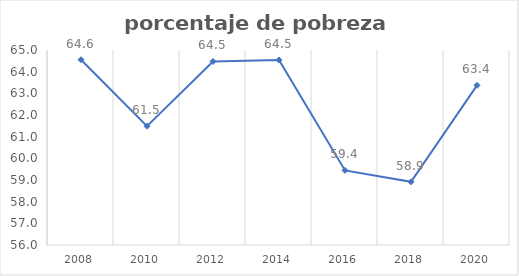
| Category | Series 0 |
|---|---|
| 2008.0 | 64.552 |
| 2010.0 | 61.483 |
| 2012.0 | 64.47 |
| 2014.0 | 64.537 |
| 2016.0 | 59.44 |
| 2018.0 | 58.917 |
| 2020.0 | 63.37 |